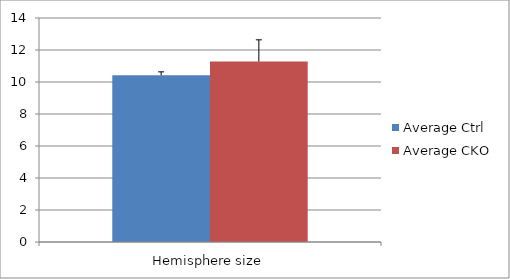
| Category | Average Ctrl | Average CKO |
|---|---|---|
| 0 | 10.416 | 11.276 |